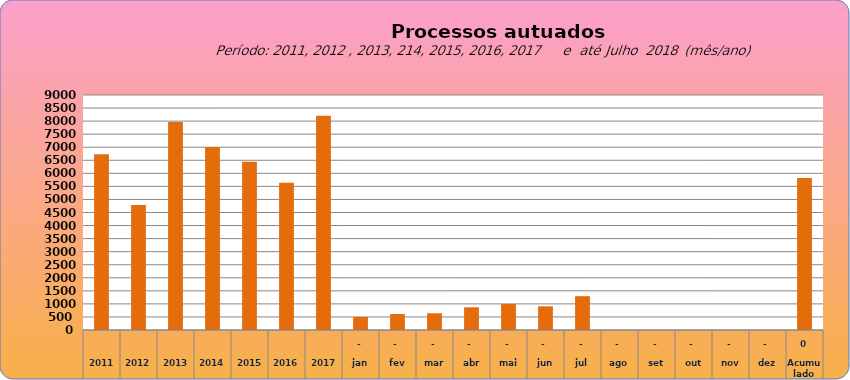
| Category | 6735 |
|---|---|
| 2011 | 6735 |
| 2012 | 4786 |
| 2013 | 7967 |
| 2014 | 7011 |
| 2015 | 6446 |
| 2016 | 5644 |
| 2017 | 8210 |
| jan | 498 |
| fev | 612 |
| mar | 642 |
| abr | 870 |
| mai | 995 |
| jun | 908 |
| jul | 1296 |
| ago | 0 |
| set | 0 |
| out | 0 |
| nov | 0 |
| dez | 0 |
| Acumulado
 | 5821 |